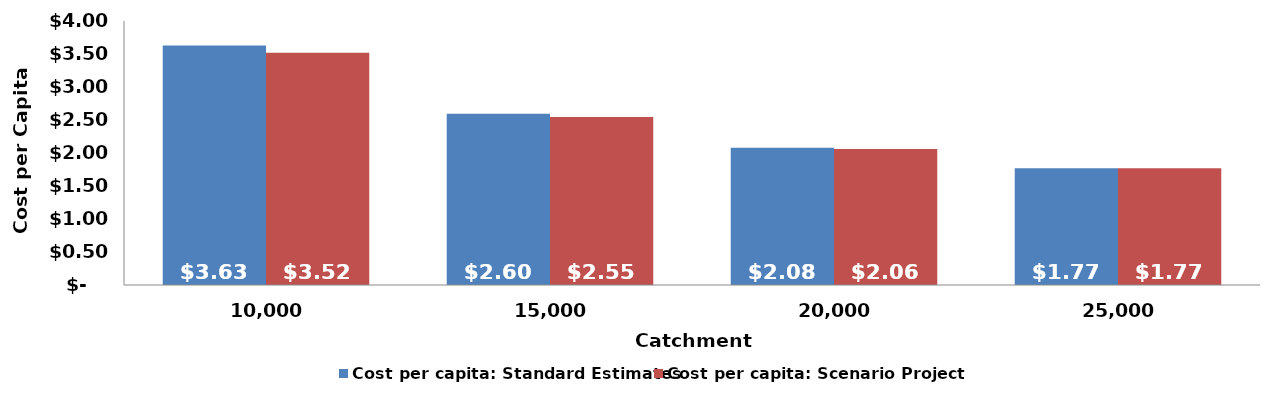
| Category | Cost per capita: Standard Estimates | Cost per capita: Scenario Projection |
|---|---|---|
| 10000.0 | 3.629 | 3.518 |
| 15000.0 | 2.596 | 2.546 |
| 20000.0 | 2.079 | 2.06 |
| 25000.0 | 1.769 | 1.769 |